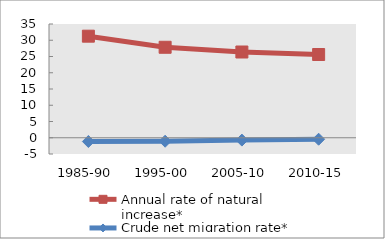
| Category | Annual rate of natural increase* | Crude net migration rate* |
|---|---|---|
| 1985-90 | 31.254 | -1.158 |
| 1995-00 | 27.841 | -1.072 |
| 2005-10 | 26.383 | -0.722 |
| 2010-15 | 25.615 | -0.454 |